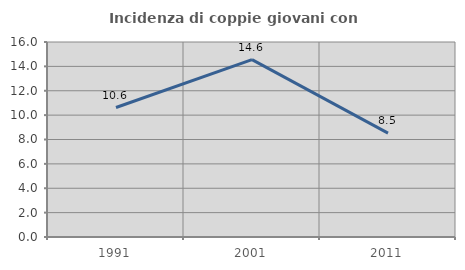
| Category | Incidenza di coppie giovani con figli |
|---|---|
| 1991.0 | 10.625 |
| 2001.0 | 14.557 |
| 2011.0 | 8.523 |